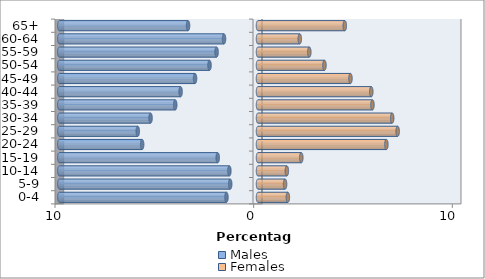
| Category | Males | Females |
|---|---|---|
| 0-4 | -1.588 | 1.502 |
| 5-9 | -1.399 | 1.362 |
| 10-14 | -1.441 | 1.452 |
| 15-19 | -2.028 | 2.179 |
| 20-24 | -5.832 | 6.463 |
| 25-29 | -6.053 | 7.03 |
| 30-34 | -5.409 | 6.754 |
| 35-39 | -4.167 | 5.761 |
| 40-44 | -3.896 | 5.703 |
| 45-49 | -3.169 | 4.654 |
| 50-54 | -2.44 | 3.345 |
| 55-59 | -2.085 | 2.583 |
| 60-64 | -1.71 | 2.103 |
| 65+ | -3.521 | 4.368 |